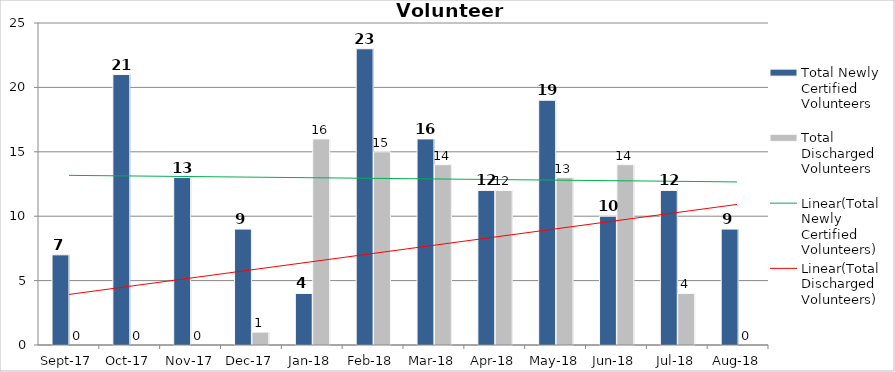
| Category | Total Newly Certified Volunteers | Total Discharged Volunteers |
|---|---|---|
| 2017-09-01 | 7 | 0 |
| 2017-10-01 | 21 | 0 |
| 2017-11-01 | 13 | 0 |
| 2017-12-01 | 9 | 1 |
| 2018-01-01 | 4 | 16 |
| 2018-02-01 | 23 | 15 |
| 2018-03-01 | 16 | 14 |
| 2018-04-01 | 12 | 12 |
| 2018-05-01 | 19 | 13 |
| 2018-06-01 | 10 | 14 |
| 2018-07-01 | 12 | 4 |
| 2018-08-01 | 9 | 0 |